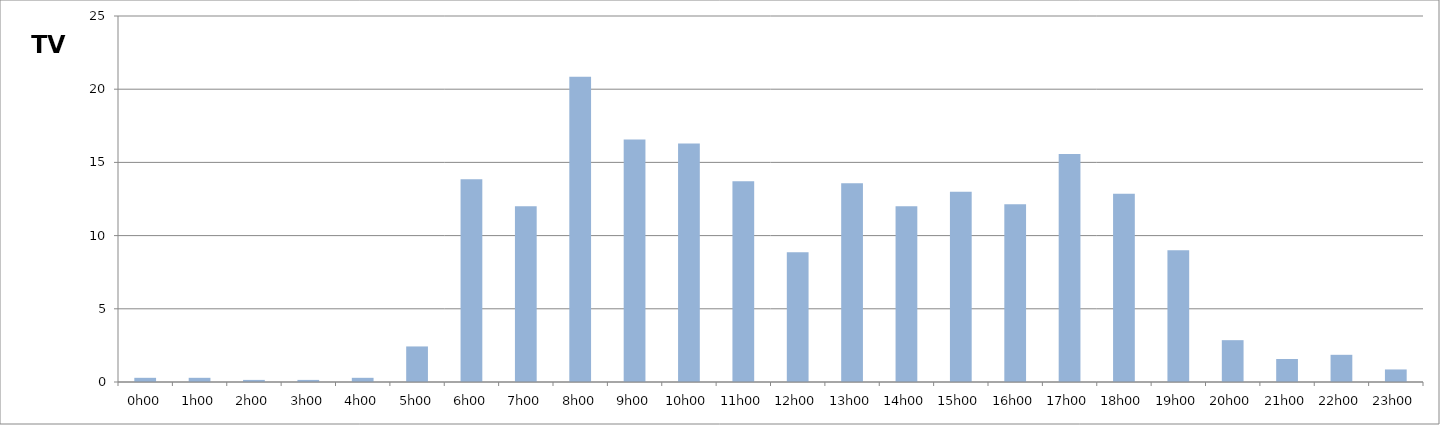
| Category | TV |
|---|---|
| 0.0 | 0.286 |
| 0.041666666666666664 | 0.286 |
| 0.08333333333333333 | 0.143 |
| 0.125 | 0.143 |
| 0.16666666666666666 | 0.286 |
| 0.20833333333333334 | 2.429 |
| 0.25 | 13.857 |
| 0.2916666666666667 | 12 |
| 0.3333333333333333 | 20.857 |
| 0.375 | 16.571 |
| 0.4166666666666667 | 16.286 |
| 0.4583333333333333 | 13.714 |
| 0.5 | 8.857 |
| 0.5416666666666666 | 13.571 |
| 0.5833333333333334 | 12 |
| 0.625 | 13 |
| 0.6666666666666666 | 12.143 |
| 0.7083333333333334 | 15.571 |
| 0.75 | 12.857 |
| 0.7916666666666666 | 9 |
| 0.8333333333333334 | 2.857 |
| 0.875 | 1.571 |
| 0.9166666666666666 | 1.857 |
| 0.9583333333333334 | 0.857 |